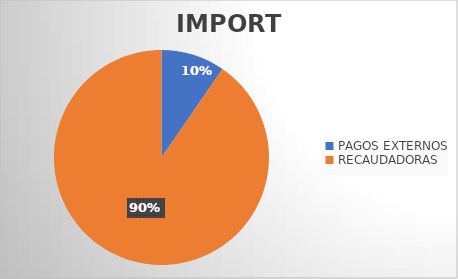
| Category | IMPORTE |
|---|---|
| PAGOS EXTERNOS | 31817699.28 |
| RECAUDADORAS | 299267472.88 |